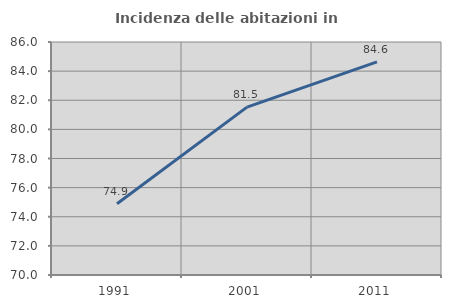
| Category | Incidenza delle abitazioni in proprietà  |
|---|---|
| 1991.0 | 74.895 |
| 2001.0 | 81.529 |
| 2011.0 | 84.635 |